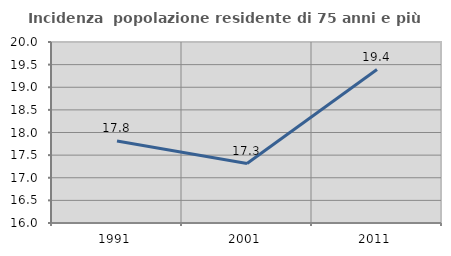
| Category | Incidenza  popolazione residente di 75 anni e più |
|---|---|
| 1991.0 | 17.811 |
| 2001.0 | 17.314 |
| 2011.0 | 19.391 |